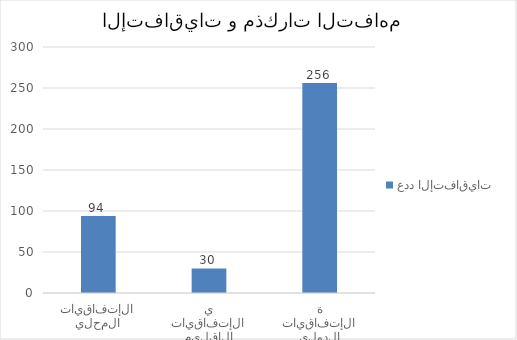
| Category | عدد الإتفاقيات  |
|---|---|
| الإتفاقيات المحلية | 94 |
| الإتفاقيات الإقليمية  | 30 |
| الإتفاقيات الدولية  | 256 |